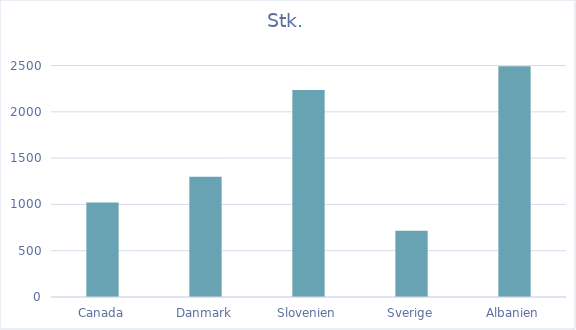
| Category | Stk. |
|---|---|
| Canada | 1021 |
| Danmark | 1298 |
| Slovenien | 2236 |
| Sverige | 716 |
| Albanien | 2491 |